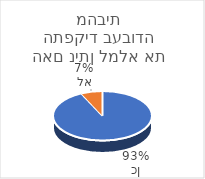
| Category | סה"כ |
|---|---|
| כן | 4161 |
| לא | 317 |